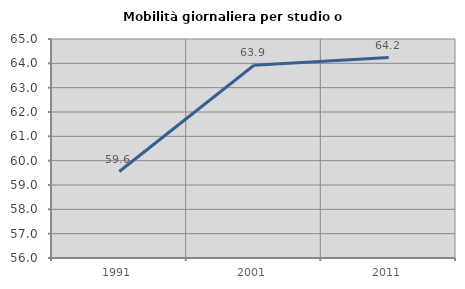
| Category | Mobilità giornaliera per studio o lavoro |
|---|---|
| 1991.0 | 59.553 |
| 2001.0 | 63.923 |
| 2011.0 | 64.235 |